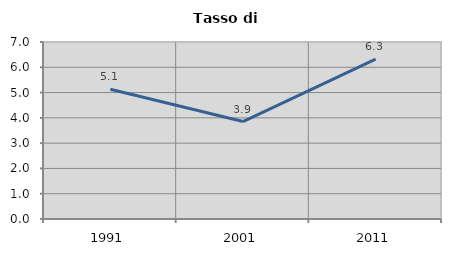
| Category | Tasso di disoccupazione   |
|---|---|
| 1991.0 | 5.129 |
| 2001.0 | 3.853 |
| 2011.0 | 6.322 |